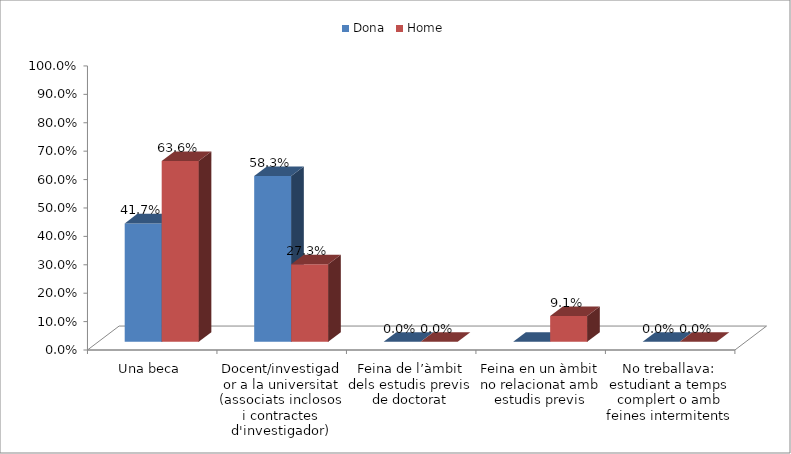
| Category | Dona | Home |
|---|---|---|
| Una beca | 0.417 | 0.636 |
| Docent/investigador a la universitat (associats inclosos i contractes d'investigador) | 0.583 | 0.273 |
| Feina de l’àmbit dels estudis previs de doctorat | 0 | 0 |
| Feina en un àmbit no relacionat amb estudis previs | 0 | 0.091 |
| No treballava: estudiant a temps complert o amb feines intermitents | 0 | 0 |